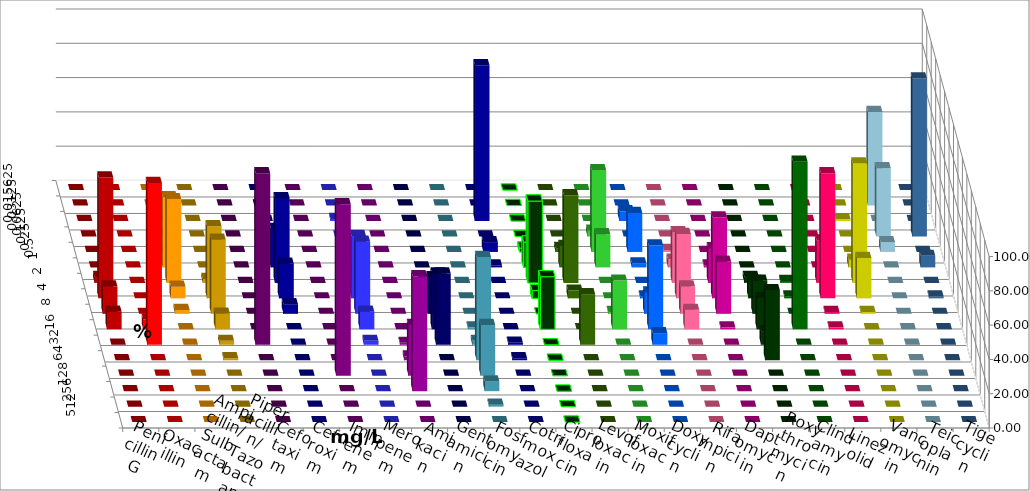
| Category | Penicillin G | Oxacillin | Ampicillin/ Sulbactam | Piperacillin/ Tazobactam | Cefotaxim | Cefuroxim | Imipenem | Meropenem | Amikacin | Gentamicin | Fosfomycin | Cotrimoxazol | Ciprofloxacin | Levofloxacin | Moxifloxacin | Doxycyclin | Rifampicin | Daptomycin | Roxythromycin | Clindamycin | Linezolid | Vancomycin | Teicoplanin | Tigecyclin |
|---|---|---|---|---|---|---|---|---|---|---|---|---|---|---|---|---|---|---|---|---|---|---|---|---|
| 0.015625 | 0 | 0 | 0 | 0 | 0 | 0 | 0 | 0 | 0 | 0 | 0 | 0 | 0 | 0 | 0 | 0 | 0 | 0 | 0 | 0 | 0 | 0 | 0 | 0 |
| 0.03125 | 0 | 0 | 0 | 0 | 0 | 0 | 0 | 0 | 0 | 0 | 0 | 0 | 0 | 0 | 0 | 0 | 0 | 0 | 0 | 0 | 0 | 0 | 0 | 54.545 |
| 0.0625 | 0 | 0 | 0 | 0 | 0 | 0 | 0 | 1.136 | 0 | 0 | 0 | 90.805 | 0 | 0 | 0 | 5.682 | 0 | 0 | 0 | 0 | 0 | 1.124 | 0 | 0 |
| 0.125 | 0 | 0 | 1.136 | 0 | 0 | 0 | 0 | 0 | 0 | 0 | 0 | 0 | 0 | 0 | 3.409 | 0 | 0 | 0 | 0 | 0 | 0 | 0 | 92.135 | 39.773 |
| 0.25 | 0 | 0 | 0 | 0 | 0 | 0 | 2.247 | 1.136 | 0 | 0 | 0 | 5.747 | 2.273 | 2.273 | 47.727 | 22.727 | 1.136 | 0 | 0 | 0 | 0 | 0 | 0 | 5.682 |
| 0.5 | 0 | 0 | 40.909 | 0 | 0 | 0 | 22.472 | 1.136 | 0 | 0 | 0 | 1.149 | 14.773 | 12.5 | 19.318 | 2.273 | 4.545 | 1.124 | 0 | 0 | 0 | 4.494 | 6.742 | 0 |
| 1.0 | 3.409 | 0 | 48.864 | 2.273 | 0 | 0 | 49.438 | 5.682 | 0 | 1.124 | 0 | 0 | 47.727 | 51.136 | 0 | 0 | 29.545 | 20.225 | 3.409 | 1.136 | 24.719 | 69.663 | 0 | 0 |
| 2.0 | 70.455 | 0 | 6.818 | 42.045 | 0 | 0 | 20.225 | 36.364 | 0 | 3.371 | 0 | 0 | 4.545 | 4.545 | 0 | 1.136 | 37.5 | 47.191 | 10.227 | 1.136 | 73.034 | 23.596 | 1.124 | 0 |
| 4.0 | 15.909 | 0 | 2.273 | 43.182 | 0 | 0 | 5.618 | 42.045 | 0 | 21.348 | 0 | 0 | 0 | 0 | 1.136 | 12.5 | 15.909 | 30.337 | 19.318 | 0 | 1.124 | 1.124 | 0 | 0 |
| 8.0 | 10.227 | 5.682 | 0 | 9.091 | 0 | 0 | 0 | 10.227 | 0 | 32.584 | 1.136 | 0 | 30.682 | 0 | 28.409 | 48.864 | 11.364 | 1.124 | 18.182 | 97.727 | 1.124 | 0 | 0 | 0 |
| 16.0 | 0 | 94.318 | 0 | 2.273 | 100 | 0 | 0 | 2.273 | 1.136 | 41.573 | 2.273 | 1.149 | 0 | 29.545 | 0 | 6.818 | 0 | 0 | 7.955 | 0 | 0 | 0 | 0 | 0 |
| 32.0 | 0 | 0 | 0 | 1.136 | 0 | 0 | 0 | 0 | 2.273 | 0 | 60.227 | 1.149 | 0 | 0 | 0 | 0 | 0 | 0 | 40.909 | 0 | 0 | 0 | 0 | 0 |
| 64.0 | 0 | 0 | 0 | 0 | 0 | 100 | 0 | 0 | 29.545 | 0 | 29.545 | 0 | 0 | 0 | 0 | 0 | 0 | 0 | 0 | 0 | 0 | 0 | 0 | 0 |
| 128.0 | 0 | 0 | 0 | 0 | 0 | 0 | 0 | 0 | 67.045 | 0 | 5.682 | 0 | 0 | 0 | 0 | 0 | 0 | 0 | 0 | 0 | 0 | 0 | 0 | 0 |
| 256.0 | 0 | 0 | 0 | 0 | 0 | 0 | 0 | 0 | 0 | 0 | 1.136 | 0 | 0 | 0 | 0 | 0 | 0 | 0 | 0 | 0 | 0 | 0 | 0 | 0 |
| 512.0 | 0 | 0 | 0 | 0 | 0 | 0 | 0 | 0 | 0 | 0 | 0 | 0 | 0 | 0 | 0 | 0 | 0 | 0 | 0 | 0 | 0 | 0 | 0 | 0 |